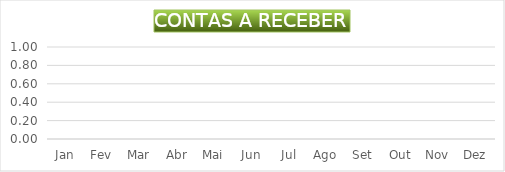
| Category | CONTAS A RECEBER |
|---|---|
| Jan | 0 |
| Fev | 0 |
| Mar | 0 |
| Abr | 0 |
| Mai | 0 |
| Jun | 0 |
| Jul | 0 |
| Ago | 0 |
| Set | 0 |
| Out | 0 |
| Nov | 0 |
| Dez | 0 |